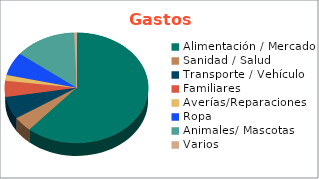
| Category | Series 0 |
|---|---|
| Alimentación / Mercado | 9000000 |
| Sanidad / Salud | 640000 |
| Transporte / Vehículo | 960000 |
| Familiares | 700000 |
| Averías/Reparaciones | 245600 |
| Ropa | 1000000 |
| Animales/ Mascotas | 2040000 |
| Varios | 76500 |